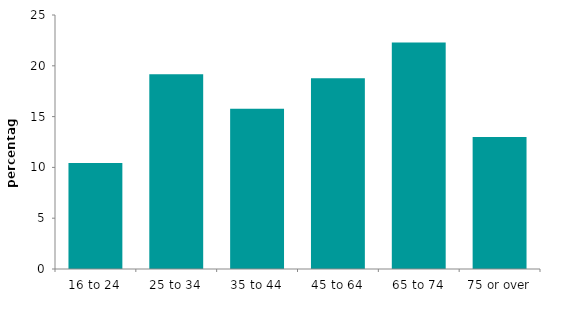
| Category | Series 0 |
|---|---|
| 16 to 24 | 10.44 |
| 25 to 34 | 19.173 |
| 35 to 44 | 15.763 |
| 45 to 64 | 18.784 |
| 65 to 74 | 22.294 |
| 75 or over | 12.996 |